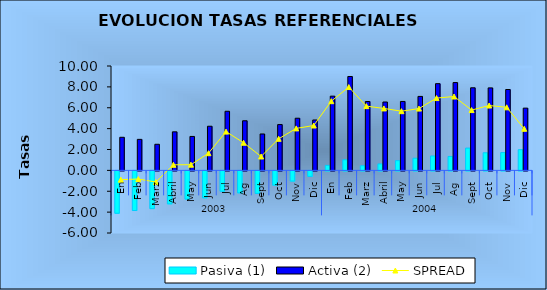
| Category | Pasiva (1) | Activa (2) |
|---|---|---|
| 0 | -4.06 | 3.17 |
| 1 | -3.799 | 2.97 |
| 2 | -3.619 | 2.501 |
| 3 | -3.159 | 3.693 |
| 4 | -2.705 | 3.25 |
| 5 | -2.583 | 4.228 |
| 6 | -1.949 | 5.662 |
| 7 | -2.106 | 4.752 |
| 8 | -2.157 | 3.487 |
| 9 | -1.366 | 4.389 |
| 10 | -0.977 | 4.996 |
| 11 | -0.528 | 4.827 |
| 12 | 0.481 | 7.111 |
| 13 | 1.011 | 8.995 |
| 14 | 0.442 | 6.597 |
| 15 | 0.617 | 6.551 |
| 16 | 0.932 | 6.604 |
| 17 | 1.167 | 7.087 |
| 18 | 1.38 | 8.307 |
| 19 | 1.335 | 8.412 |
| 20 | 2.136 | 7.913 |
| 21 | 1.688 | 7.901 |
| 22 | 1.707 | 7.748 |
| 23 | 1.981 | 5.964 |